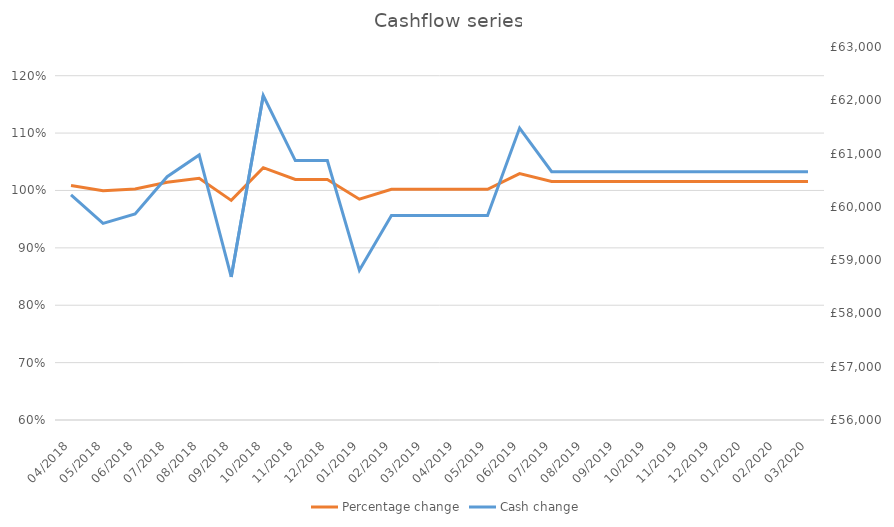
| Category | Percentage change |
|---|---|
| 2018-04-01 | 1.009 |
| 2018-05-01 | 1 |
| 2018-06-01 | 1.002 |
| 2018-07-01 | 1.014 |
| 2018-08-01 | 1.021 |
| 2018-09-01 | 0.983 |
| 2018-10-01 | 1.04 |
| 2018-11-01 | 1.019 |
| 2018-12-01 | 1.019 |
| 2019-01-01 | 0.985 |
| 2019-02-01 | 1.002 |
| 2019-03-01 | 1.002 |
| 2019-04-01 | 1.002 |
| 2019-05-01 | 1.002 |
| 2019-06-01 | 1.029 |
| 2019-07-01 | 1.016 |
| 2019-08-01 | 1.016 |
| 2019-09-01 | 1.016 |
| 2019-10-01 | 1.016 |
| 2019-11-01 | 1.016 |
| 2019-12-01 | 1.016 |
| 2020-01-01 | 1.016 |
| 2020-02-01 | 1.016 |
| 2020-03-01 | 1.016 |